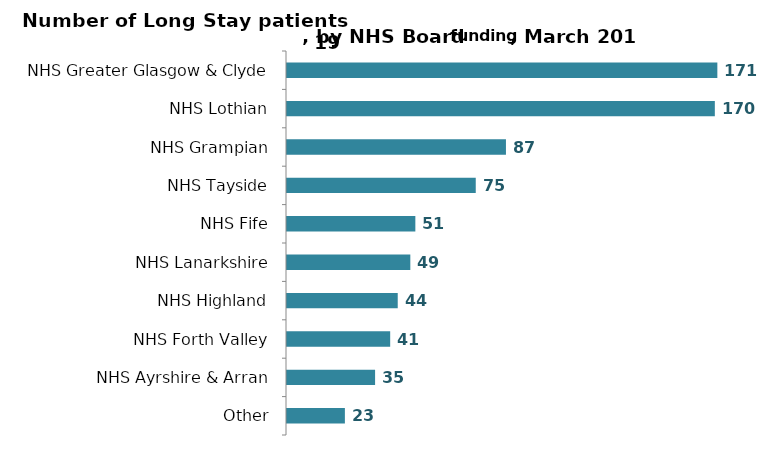
| Category | Series 0 |
|---|---|
| NHS Greater Glasgow & Clyde | 171 |
| NHS Lothian | 170 |
| NHS Grampian | 87 |
| NHS Tayside | 75 |
| NHS Fife | 51 |
| NHS Lanarkshire | 49 |
| NHS Highland | 44 |
| NHS Forth Valley | 41 |
| NHS Ayrshire & Arran | 35 |
| Other | 23 |